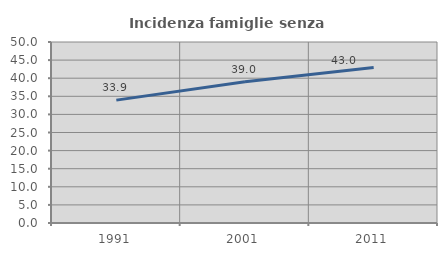
| Category | Incidenza famiglie senza nuclei |
|---|---|
| 1991.0 | 33.939 |
| 2001.0 | 38.994 |
| 2011.0 | 42.953 |